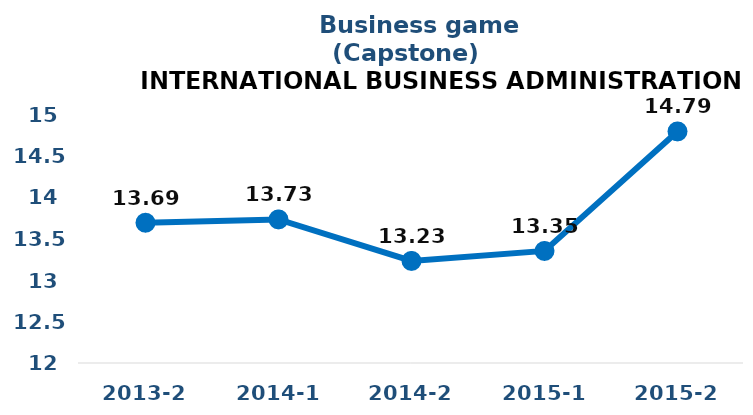
| Category | Series 0 |
|---|---|
| 2013-2 | 13.69 |
| 2014-1 | 13.73 |
| 2014-2 | 13.23 |
| 2015-1 | 13.35 |
| 2015-2 | 14.79 |